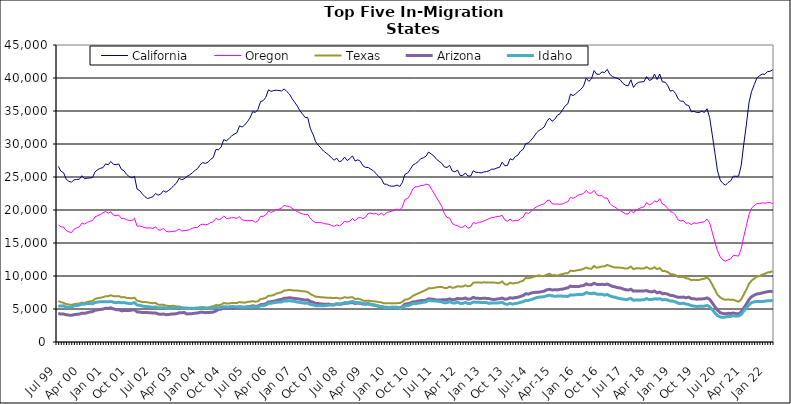
| Category | California | Oregon | Texas | Arizona | Idaho |
|---|---|---|---|---|---|
| Jul 99 | 26605 | 17749 | 6209 | 4339 | 5471 |
| Aug 99 | 25882 | 17447 | 6022 | 4228 | 5444 |
| Sep 99 | 25644 | 17401 | 5941 | 4237 | 5488 |
| Oct 99 | 24669 | 16875 | 5751 | 4134 | 5279 |
| Nov 99 | 24353 | 16701 | 5680 | 4073 | 5260 |
| Dec 99 | 24218 | 16570 | 5619 | 4042 | 5269 |
| Jan 00 | 24574 | 17109 | 5736 | 4142 | 5485 |
| Feb 00 | 24620 | 17295 | 5789 | 4192 | 5530 |
| Mar 00 | 24655 | 17436 | 5826 | 4226 | 5590 |
| Apr 00 | 25195 | 18009 | 5980 | 4375 | 5748 |
| May 00 | 24730 | 17875 | 5897 | 4337 | 5729 |
| Jun 00 | 24825 | 18113 | 6070 | 4444 | 5853 |
| Jul 00 | 24857 | 18294 | 6163 | 4555 | 5824 |
| Aug 00 | 24913 | 18376 | 6199 | 4603 | 5788 |
| Sep 00 | 25792 | 18971 | 6529 | 4804 | 5976 |
| Oct 00 | 26106 | 19135 | 6643 | 4870 | 6058 |
| Nov 00 | 26315 | 19306 | 6705 | 4926 | 6085 |
| Dec 00 | 26415 | 19570 | 6793 | 4991 | 6096 |
| Jan 01 | 26995 | 19781 | 6942 | 5122 | 6119 |
| Feb 01 | 26851 | 19519 | 6948 | 5089 | 6090 |
| Mar 01 | 27352 | 19720 | 7080 | 5180 | 6143 |
| Apr 01 | 26918 | 19221 | 6943 | 5020 | 6020 |
| May 01 | 26848 | 19126 | 6924 | 4899 | 5950 |
| Jun 01 | 26974 | 19241 | 6959 | 4895 | 6019 |
| Jul 01 | 26172 | 18725 | 6778 | 4737 | 5951 |
| Aug 01 | 25943 | 18736 | 6810 | 4757 | 5973 |
| Sep 01 | 25399 | 18514 | 6688 | 4753 | 5895 |
| Oct 01 | 25050 | 18415 | 6650 | 4780 | 5833 |
| Nov 01 | 24873 | 18381 | 6631 | 4826 | 5850 |
| Dec 01 | 25099 | 18765 | 6708 | 4898 | 5969 |
| Jan 02 | 23158 | 17561 | 6261 | 4560 | 5595 |
| Feb 02 | 22926 | 17573 | 6162 | 4531 | 5560 |
| Mar 02 | 22433 | 17452 | 6052 | 4481 | 5458 |
| Apr 02 | 22012 | 17314 | 6046 | 4458 | 5380 |
| May 02 | 21733 | 17267 | 6007 | 4452 | 5358 |
| Jun 02 | 21876 | 17298 | 5933 | 4444 | 5315 |
| Jul 02 | 21997 | 17209 | 5873 | 4383 | 5243 |
| Aug 02 | 22507 | 17436 | 5929 | 4407 | 5315 |
| Sep 02 | 22244 | 17010 | 5672 | 4248 | 5192 |
| Oct 02 | 22406 | 16952 | 5625 | 4191 | 5167 |
| Nov 02 | 22922 | 17223 | 5663 | 4242 | 5221 |
| Dec 02 | 22693 | 16770 | 5499 | 4142 | 5120 |
| Jan 03 | 22964 | 16694 | 5463 | 4166 | 5089 |
| Feb 03 | 23276 | 16727 | 5461 | 4226 | 5077 |
| Mar 03 | 23736 | 16766 | 5486 | 4251 | 5145 |
| Apr 03 | 24079 | 16859 | 5389 | 4289 | 5145 |
| May 03 | 24821 | 17117 | 5378 | 4415 | 5254 |
| Jun 03 | 24592 | 16812 | 5273 | 4426 | 5135 |
| Jul 03 | 24754 | 16875 | 5226 | 4466 | 5124 |
| Aug 03 | 25092 | 16922 | 5181 | 4244 | 5100 |
| Sep 03 | 25316 | 17036 | 5181 | 4279 | 5086 |
| Oct 03 | 25622 | 17228 | 5139 | 4301 | 5110 |
| Nov 03 | 25984 | 17335 | 5175 | 4362 | 5091 |
| Dec 03 | 26269 | 17350 | 5189 | 4396 | 5113 |
| Jan 04 | 26852 | 17734 | 5255 | 4492 | 5152 |
| Feb 04 | 27184 | 17860 | 5301 | 4502 | 5183 |
| Mar 04 | 27062 | 17757 | 5227 | 4443 | 5056 |
| Apr 04 | 27238 | 17840 | 5227 | 4461 | 5104 |
| May 04 | 27671 | 18113 | 5345 | 4493 | 5095 |
| Jun 04 | 27949 | 18201 | 5416 | 4532 | 5103 |
| Jul 04 | 29172 | 18727 | 5597 | 4697 | 5231 |
| Aug 04 | 29122 | 18529 | 5561 | 4945 | 5197 |
| Sep 04 | 29542 | 18678 | 5656 | 4976 | 5237 |
| Oct 04 | 30674 | 19108 | 5922 | 5188 | 5363 |
| Nov 04 | 30472 | 18716 | 5823 | 5106 | 5321 |
| Dec 04 | 30831 | 18755 | 5838 | 5135 | 5312 |
| Jan 05 | 31224 | 18823 | 5906 | 5155 | 5374 |
| Feb 05 | 31495 | 18842 | 5898 | 5168 | 5357 |
| Mar 05 | 31714 | 18738 | 5894 | 5212 | 5313 |
| Apr 05 | 32750 | 18998 | 6060 | 5340 | 5350 |
| May 05 | 32575 | 18504 | 5989 | 5269 | 5276 |
| Jun 05 | 32898 | 18414 | 5954 | 5252 | 5271 |
| Jul 05 | 33384 | 18395 | 6062 | 5322 | 5322 |
| Aug 05 | 33964 | 18381 | 6113 | 5375 | 5316 |
| Sep 05 | 34897 | 18426 | 6206 | 5493 | 5362 |
| Oct 05 | 34780 | 18132 | 6100 | 5408 | 5308 |
| Nov 05 | 35223 | 18332 | 6162 | 5434 | 5314 |
| Dec 05 | 36415 | 19047 | 6508 | 5658 | 5487 |
| Jan 06 | 36567 | 19032 | 6576 | 5688 | 5480 |
| Feb 06 | 37074 | 19257 | 6692 | 5792 | 5616 |
| Mar 06 | 38207 | 19845 | 6993 | 6052 | 5850 |
| Apr 06 | 37976 | 19637 | 7024 | 6101 | 5864 |
| May 06 | 38099 | 19781 | 7114 | 6178 | 5943 |
| Jun 06 | 38141 | 20061 | 7331 | 6276 | 6018 |
| Jul 06 | 38097 | 20111 | 7431 | 6399 | 6046 |
| Aug 06 | 38021 | 20333 | 7542 | 6450 | 6064 |
| Sep 06 | 38349 | 20686 | 7798 | 6627 | 6232 |
| Oct 06 | 37947 | 20591 | 7825 | 6647 | 6216 |
| Nov 06 | 37565 | 20526 | 7907 | 6707 | 6244 |
| Dec 06 | 36884 | 20272 | 7840 | 6648 | 6192 |
| Jan 07 | 36321 | 19984 | 7789 | 6597 | 6151 |
| Feb 07 | 35752 | 19752 | 7799 | 6554 | 6048 |
| Mar 07 | 35025 | 19547 | 7737 | 6487 | 5989 |
| Apr 07 | 34534 | 19412 | 7685 | 6430 | 5937 |
| May 07 | 34022 | 19296 | 7654 | 6353 | 5858 |
| Jun 07 | 33974 | 19318 | 7577 | 6390 | 5886 |
| Jul 07 | 32298 | 18677 | 7250 | 6117 | 5682 |
| Aug 07 | 31436 | 18322 | 7070 | 6034 | 5617 |
| Sep 07 | 30331 | 18087 | 6853 | 5847 | 5500 |
| Oct 07 | 29813 | 18108 | 6839 | 5821 | 5489 |
| Nov 07 | 29384 | 18105 | 6777 | 5769 | 5481 |
| Dec 07 | 28923 | 17949 | 6760 | 5733 | 5499 |
| Jan 08 | 28627 | 17890 | 6721 | 5732 | 5521 |
| Feb 08 | 28328 | 17834 | 6719 | 5749 | 5579 |
| Mar 08 | 27911 | 17680 | 6690 | 5650 | 5614 |
| Apr 08 | 27543 | 17512 | 6656 | 5612 | 5635 |
| May 08 | 27856 | 17754 | 6705 | 5774 | 5798 |
| Jun 08 | 27287 | 17589 | 6593 | 5717 | 5745 |
| Jul 08 | 27495 | 17834 | 6623 | 5761 | 5807 |
| Aug 08 | 28018 | 18309 | 6789 | 5867 | 5982 |
| Sep-08 | 27491 | 18164 | 6708 | 5864 | 5954 |
| Oct 08 | 27771 | 18291 | 6755 | 5942 | 6032 |
| Nov 08 | 28206 | 18706 | 6787 | 5970 | 6150 |
| Dec 08 | 27408 | 18353 | 6505 | 5832 | 5975 |
| Jan 09 | 27601 | 18778 | 6569 | 5890 | 5995 |
| Feb 09 | 27394 | 18863 | 6483 | 5845 | 5936 |
| Mar 09 | 26690 | 18694 | 6273 | 5751 | 5806 |
| Apr 09 | 26461 | 18943 | 6222 | 5735 | 5777 |
| May 09 | 26435 | 19470 | 6272 | 5819 | 5767 |
| Jun 09 | 26187 | 19522 | 6199 | 5700 | 5649 |
| Jul 09 | 25906 | 19408 | 6171 | 5603 | 5617 |
| Aug 09 | 25525 | 19469 | 6128 | 5533 | 5540 |
| Sep 09 | 25050 | 19249 | 6059 | 5405 | 5437 |
| Oct 09 | 24741 | 19529 | 6004 | 5349 | 5369 |
| Nov 09 | 23928 | 19187 | 5854 | 5271 | 5248 |
| Dec 09 | 23899 | 19607 | 5886 | 5261 | 5195 |
| Jan 10 | 23676 | 19703 | 5881 | 5232 | 5234 |
| Feb 10 | 23592 | 19845 | 5850 | 5272 | 5236 |
| Mar 10 | 23634 | 19946 | 5864 | 5278 | 5219 |
| Apr 10 | 23774 | 20134 | 5889 | 5257 | 5201 |
| May 10 | 23567 | 19966 | 5897 | 5172 | 5105 |
| Jun 10 | 24166 | 20464 | 6087 | 5356 | 5237 |
| Jul 10 | 25410 | 21627 | 6417 | 5742 | 5452 |
| Aug 10 | 25586 | 21744 | 6465 | 5797 | 5491 |
| Sep 10 | 26150 | 22314 | 6667 | 5907 | 5609 |
| Oct 10 | 26807 | 23219 | 6986 | 6070 | 5831 |
| Nov 10 | 27033 | 23520 | 7179 | 6100 | 5810 |
| Dec 10 | 27332 | 23551 | 7361 | 6182 | 5898 |
| Jan 11 | 27769 | 23697 | 7525 | 6276 | 5938 |
| Feb 11 | 27898 | 23718 | 7708 | 6267 | 6016 |
| Mar 11 | 28155 | 23921 | 7890 | 6330 | 6081 |
| Apr 11 | 28790 | 23847 | 8146 | 6544 | 6305 |
| May 11 | 28471 | 23215 | 8131 | 6502 | 6248 |
| Jun 11 | 28191 | 22580 | 8199 | 6445 | 6217 |
| Jul 11 | 27678 | 21867 | 8291 | 6368 | 6202 |
| Aug 11 | 27372 | 21203 | 8321 | 6356 | 6146 |
| Sep 11 | 27082 | 20570 | 8341 | 6387 | 6075 |
| Oct 11 | 26528 | 19442 | 8191 | 6402 | 5932 |
| Nov 11 | 26440 | 18872 | 8176 | 6426 | 5968 |
| Dec 11 | 26770 | 18784 | 8401 | 6533 | 6106 |
| Jan 12 | 25901 | 17963 | 8202 | 6390 | 5933 |
| Feb 12 | 25796 | 17718 | 8266 | 6456 | 5900 |
| Mar 12 | 26042 | 17647 | 8456 | 6600 | 6054 |
| Apr 12 | 25239 | 17386 | 8388 | 6534 | 5838 |
| May 12 | 25238 | 17407 | 8401 | 6558 | 5854 |
| Jun 12 | 25593 | 17673 | 8594 | 6669 | 6009 |
| Jul 12 | 25155 | 17237 | 8432 | 6474 | 5817 |
| Aug 12 | 25146 | 17391 | 8536 | 6539 | 5842 |
| Sep 12 | 25942 | 18102 | 8989 | 6759 | 6061 |
| Oct 12 | 25718 | 17953 | 9012 | 6618 | 6027 |
| Nov 12 | 25677 | 18134 | 9032 | 6611 | 6009 |
| Dec 12 | 25619 | 18166 | 8981 | 6601 | 5999 |
| Jan 13 | 25757 | 18344 | 9051 | 6627 | 5989 |
| Feb-13 | 25830 | 18512 | 9001 | 6606 | 5968 |
| Mar-13 | 25940 | 18689 | 9021 | 6577 | 5853 |
| Apr 13 | 26187 | 18844 | 9013 | 6478 | 5925 |
| May 13 | 26192 | 18884 | 9003 | 6431 | 5924 |
| Jun-13 | 26362 | 19013 | 8948 | 6508 | 5896 |
| Jul 13 | 26467 | 19037 | 8958 | 6559 | 5948 |
| Aug 13 | 27253 | 19198 | 9174 | 6655 | 6020 |
| Sep 13 | 26711 | 18501 | 8747 | 6489 | 5775 |
| Oct 13 | 26733 | 18301 | 8681 | 6511 | 5711 |
| Nov 13 | 27767 | 18620 | 8989 | 6709 | 5860 |
| Dec 13 | 27583 | 18320 | 8863 | 6637 | 5740 |
| Jan 14 | 28107 | 18409 | 8939 | 6735 | 5843 |
| Feb-14 | 28313 | 18383 | 8989 | 6779 | 5893 |
| Mar 14 | 28934 | 18696 | 9160 | 6918 | 6015 |
| Apr 14 | 29192 | 18946 | 9291 | 7036 | 6099 |
| May 14 | 30069 | 19603 | 9701 | 7314 | 6304 |
| Jun 14 | 30163 | 19487 | 9641 | 7252 | 6293 |
| Jul-14 | 30587 | 19754 | 9752 | 7415 | 6427 |
| Aug-14 | 31074 | 20201 | 9882 | 7499 | 6557 |
| Sep 14 | 31656 | 20459 | 9997 | 7536 | 6719 |
| Oct 14 | 32037 | 20663 | 10109 | 7555 | 6786 |
| Nov 14 | 32278 | 20825 | 9992 | 7628 | 6831 |
| Dec 14 | 32578 | 20918 | 10006 | 7705 | 6860 |
| Jan 15 | 33414 | 21396 | 10213 | 7906 | 7000 |
| Feb 15 | 33922 | 21518 | 10337 | 7982 | 7083 |
| Mar 15 | 33447 | 20942 | 10122 | 7891 | 7006 |
| Apr-15 | 33731 | 20893 | 10138 | 7906 | 6931 |
| May 15 | 34343 | 20902 | 10053 | 7895 | 6952 |
| Jun-15 | 34572 | 20870 | 10192 | 7973 | 6966 |
| Jul 15 | 35185 | 20916 | 10303 | 8000 | 6949 |
| Aug 15 | 35780 | 21115 | 10399 | 8126 | 6938 |
| Sep 15 | 36109 | 21246 | 10428 | 8207 | 6896 |
| Oct 15 | 37555 | 21908 | 10813 | 8477 | 7140 |
| Nov 15 | 37319 | 21750 | 10763 | 8390 | 7112 |
| Dec 15 | 37624 | 21990 | 10807 | 8395 | 7149 |
| Jan 16 | 37978 | 22248 | 10892 | 8388 | 7201 |
| Feb 16 | 38285 | 22369 | 10951 | 8508 | 7192 |
| Mar 16 | 38792 | 22506 | 11075 | 8547 | 7226 |
| Apr 16 | 39994 | 22999 | 11286 | 8815 | 7487 |
| May 16 | 39488 | 22548 | 11132 | 8673 | 7382 |
| Jun 16 | 39864 | 22556 | 11100 | 8682 | 7315 |
| Jul 16 | 41123 | 22989 | 11516 | 8903 | 7420 |
| Aug 16 | 40573 | 22333 | 11251 | 8731 | 7261 |
| Sep 16 | 40560 | 22162 | 11340 | 8692 | 7216 |
| Oct 16 | 40923 | 22172 | 11456 | 8742 | 7233 |
| Nov 16 | 40817 | 21818 | 11459 | 8685 | 7101 |
| Dec 16 | 41311 | 21815 | 11681 | 8783 | 7203 |
| Jan 17 | 40543 | 21029 | 11524 | 8609 | 6982 |
| Feb 17 | 40218 | 20613 | 11385 | 8416 | 6852 |
| Mar 17 | 40052 | 20425 | 11276 | 8354 | 6775 |
| Apr 17 | 39913 | 20147 | 11297 | 8218 | 6653 |
| May 17 | 39695 | 19910 | 11265 | 8196 | 6552 |
| Jun 17 | 39177 | 19650 | 11225 | 8034 | 6500 |
| Jul 17 | 38901 | 19419 | 11115 | 7923 | 6429 |
| Aug 17 | 38827 | 19389 | 11168 | 7867 | 6479 |
| Sep 17 | 39736 | 19936 | 11426 | 7991 | 6609 |
| Oct 17 | 38576 | 19547 | 11041 | 7708 | 6315 |
| Nov 17 | 39108 | 20013 | 11158 | 7746 | 6381 |
| Dec 17 | 39359 | 20202 | 11185 | 7743 | 6366 |
| Jan 18 | 39420 | 20362 | 11118 | 7736 | 6380 |
| Feb 18 | 39440 | 20476 | 11128 | 7741 | 6407 |
| Mar 18 | 40218 | 21106 | 11362 | 7789 | 6578 |
| Apr 18 | 39637 | 20788 | 11111 | 7642 | 6423 |
| May 18 | 39777 | 20933 | 11097 | 7591 | 6430 |
| Jun 18 | 40602 | 21381 | 11317 | 7721 | 6554 |
| Jul 18 | 39767 | 21189 | 11038 | 7445 | 6489 |
| Aug 18 | 40608 | 21729 | 11200 | 7560 | 6569 |
| Sep 18 | 39395 | 20916 | 10772 | 7318 | 6383 |
| Oct 18 | 39383 | 20724 | 10740 | 7344 | 6429 |
| Nov 18 | 38891 | 20265 | 10605 | 7255 | 6365 |
| Dec 18 | 38013 | 19741 | 10292 | 7069 | 6205 |
| Jan 19 | 38130 | 19643 | 10261 | 7032 | 6203 |
| Feb 19 | 37658 | 19237 | 10132 | 6892 | 6073 |
| Mar 19 | 36831 | 18492 | 9848 | 6766 | 5863 |
| Apr 19 | 36492 | 18349 | 9839 | 6763 | 5827 |
| May 19 | 36481 | 18407 | 9867 | 6809 | 5873 |
| Jun 19 | 35925 | 17998 | 9661 | 6698 | 5761 |
| Jul 19 | 35843 | 18049 | 9598 | 6800 | 5673 |
| Aug 19 | 34870 | 17785 | 9361 | 6577 | 5512 |
| Sep 19 | 34945 | 18038 | 9428 | 6547 | 5437 |
| Oct 19 | 34802 | 17977 | 9385 | 6483 | 5390 |
| Nov 19 | 34775 | 18072 | 9403 | 6511 | 5401 |
| Dec 19 | 34976 | 18140 | 9518 | 6521 | 5419 |
| Jan 20 | 34774 | 18209 | 9594 | 6561 | 5434 |
| Feb 20 | 35352 | 18632 | 9804 | 6682 | 5543 |
| Mar 20 | 34013 | 18041 | 9411 | 6464 | 5330 |
| Apr 20 | 31385 | 16629 | 8666 | 5922 | 4906 |
| May 20 | 28657 | 15123 | 7927 | 5355 | 4419 |
| Jun 20 | 25915 | 13817 | 7164 | 4815 | 3992 |
| Jul 20 | 24545 | 12926 | 6776 | 4457 | 3810 |
| Aug 20 | 24048 | 12443 | 6521 | 4326 | 3720 |
| Sep 20 | 23756 | 12258 | 6386 | 4266 | 3784 |
| Oct 20 | 24166 | 12429 | 6452 | 4347 | 3861 |
| Nov 20 | 24404 | 12597 | 6386 | 4324 | 3883 |
| Dec 20 | 25120 | 13122 | 6420 | 4394 | 3974 |
| Jan 21 | 25111 | 13080 | 6236 | 4304 | 3924 |
| Feb 21 | 25114 | 13015 | 6094 | 4260 | 3930 |
| Mar 21 | 26701 | 14096 | 6455 | 4567 | 4185 |
| Apr 21 | 29998 | 15978 | 7222 | 5164 | 4697 |
| May 21 | 33020 | 17641 | 7969 | 5748 | 5148 |
| Jun 21 | 36320 | 19369 | 8840 | 6450 | 5628 |
| Jul 21 | 37989 | 20320 | 9306 | 6877 | 5984 |
| Aug 21 | 39007 | 20657 | 9615 | 7094 | 6084 |
| Sep 21 | 40023 | 20974 | 9914 | 7277 | 6151 |
| Oct 21 | 40348 | 20966 | 10003 | 7327 | 6140 |
| Nov 21 | 40599 | 21096 | 10203 | 7437 | 6136 |
| Dec 21 | 40548 | 21032 | 10328 | 7532 | 6183 |
| Jan 22 | 40967 | 21106 | 10535 | 7618 | 6237 |
| Feb 22 | 41019 | 21125 | 10579 | 7673 | 6236 |
| Mar 22 | 41220 | 20949 | 10751 | 7660 | 6310 |